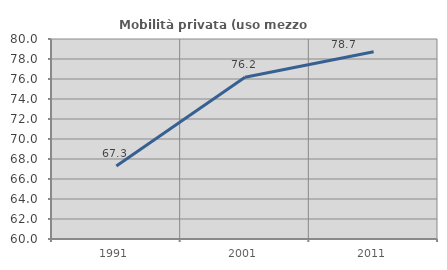
| Category | Mobilità privata (uso mezzo privato) |
|---|---|
| 1991.0 | 67.305 |
| 2001.0 | 76.173 |
| 2011.0 | 78.726 |